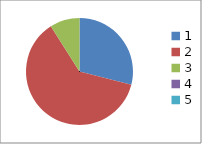
| Category | Series 0 |
|---|---|
| 0 | 0.29 |
| 1 | 0.62 |
| 2 | 0.09 |
| 3 | 0 |
| 4 | 0 |